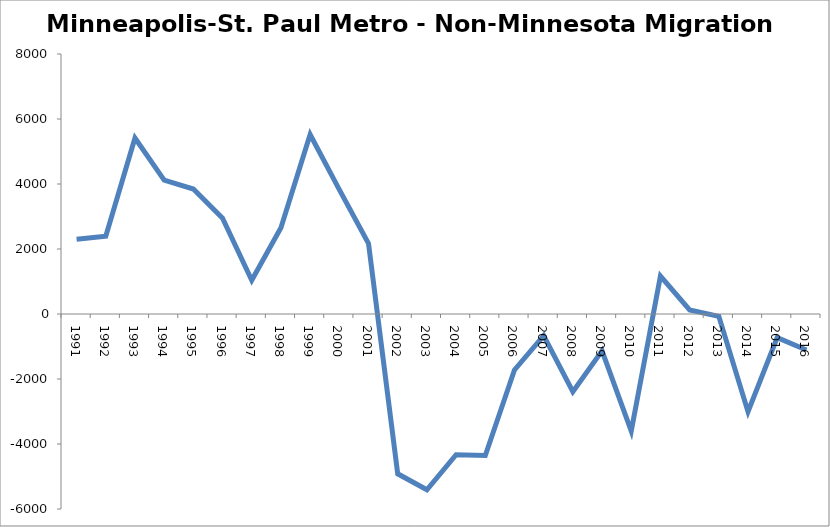
| Category | Series 0 |
|---|---|
| 1991.0 | 2298 |
| 1992.0 | 2391 |
| 1993.0 | 5416 |
| 1994.0 | 4119 |
| 1995.0 | 3846 |
| 1996.0 | 2947 |
| 1997.0 | 1039 |
| 1998.0 | 2656 |
| 1999.0 | 5522 |
| 2000.0 | 3828 |
| 2001.0 | 2171 |
| 2002.0 | -4917 |
| 2003.0 | -5409 |
| 2004.0 | -4328 |
| 2005.0 | -4352 |
| 2006.0 | -1723 |
| 2007.0 | -664 |
| 2008.0 | -2388 |
| 2009.0 | -1132 |
| 2010.0 | -3602 |
| 2011.0 | 1166 |
| 2012.0 | 124 |
| 2013.0 | -73 |
| 2014.0 | -3006 |
| 2015.0 | -727 |
| 2016.0 | -1109 |